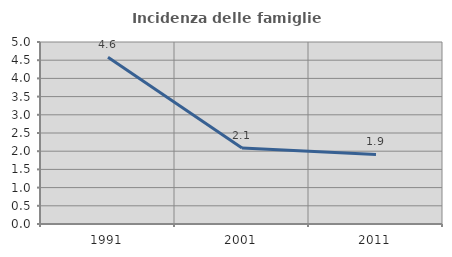
| Category | Incidenza delle famiglie numerose |
|---|---|
| 1991.0 | 4.581 |
| 2001.0 | 2.086 |
| 2011.0 | 1.911 |